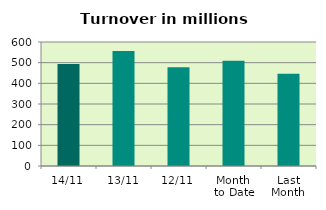
| Category | Series 0 |
|---|---|
| 14/11 | 493.941 |
| 13/11 | 556.101 |
| 12/11 | 477.632 |
| Month 
to Date | 508.717 |
| Last
Month | 446.481 |